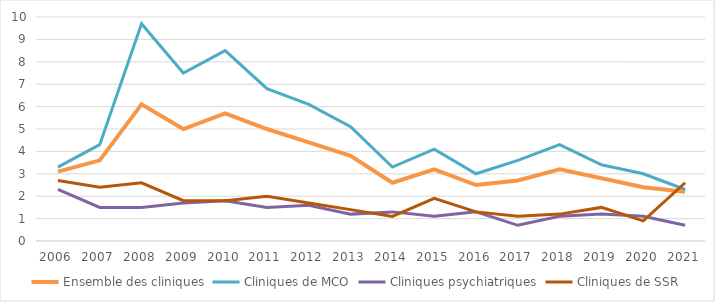
| Category | Ensemble des cliniques | Cliniques de MCO | Cliniques psychiatriques | Cliniques de SSR |
|---|---|---|---|---|
| 2006 | 3.1 | 3.3 | 2.3 | 2.7 |
| 2007 | 3.6 | 4.3 | 1.5 | 2.4 |
| 2008 | 6.1 | 9.7 | 1.5 | 2.6 |
| 2009 | 5 | 7.5 | 1.7 | 1.8 |
| 2010 | 5.7 | 8.5 | 1.8 | 1.8 |
| 2011 | 5 | 6.8 | 1.5 | 2 |
| 2012 | 4.4 | 6.1 | 1.6 | 1.7 |
| 2013 | 3.8 | 5.1 | 1.2 | 1.4 |
| 2014 | 2.6 | 3.3 | 1.3 | 1.1 |
| 2015 | 3.2 | 4.1 | 1.1 | 1.9 |
| 2016 | 2.5 | 3 | 1.3 | 1.3 |
| 2017 | 2.7 | 3.6 | 0.7 | 1.1 |
| 2018 | 3.2 | 4.3 | 1.1 | 1.2 |
| 2019 | 2.8 | 3.4 | 1.2 | 1.5 |
| 2020 | 2.4 | 3 | 1.1 | 0.9 |
| 2021 | 2.2 | 2.3 | 0.7 | 2.6 |